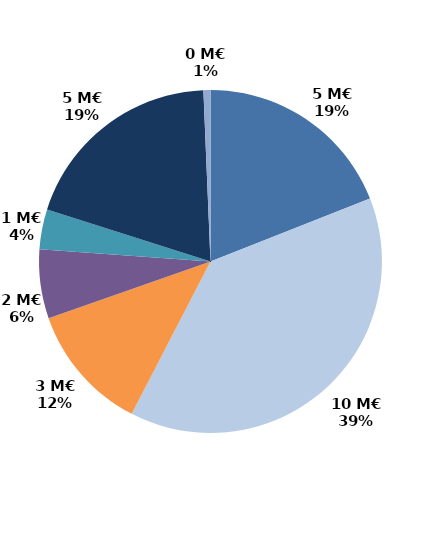
| Category | Series 0 |
|---|---|
| Accueil et information (CEP 1) | 4.751 |
| Accompagnement renforcé (CEP 2 et 3) | 9.637 |
| Suivi | 3.009 |
| Missions locales | 1.621 |
| CSP | 0.94 |
| Aide à la création d'entreprise | 4.857 |
| Aide à l'insertion | 0.165 |